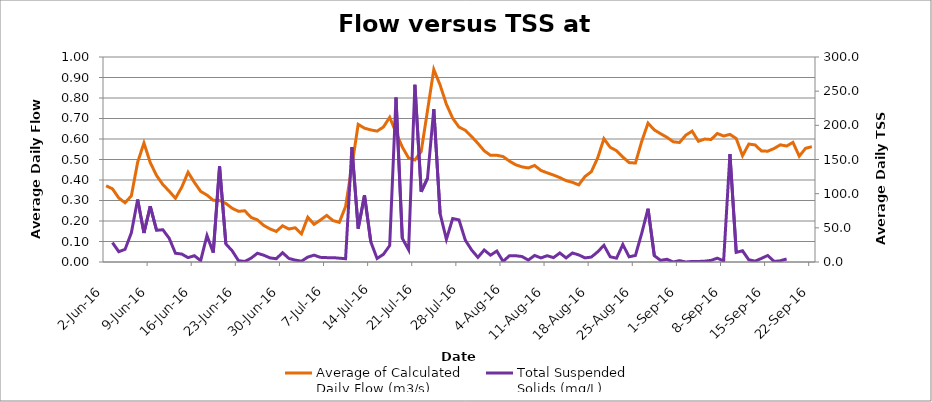
| Category | Average of Calculated 
Daily Flow (m3/s) |
|---|---|
| 2016-06-02 | 0.372 |
| 2016-06-03 | 0.357 |
| 2016-06-04 | 0.313 |
| 2016-06-05 | 0.289 |
| 2016-06-06 | 0.323 |
| 2016-06-07 | 0.486 |
| 2016-06-08 | 0.581 |
| 2016-06-09 | 0.485 |
| 2016-06-10 | 0.422 |
| 2016-06-11 | 0.378 |
| 2016-06-12 | 0.346 |
| 2016-06-13 | 0.311 |
| 2016-06-14 | 0.365 |
| 2016-06-15 | 0.438 |
| 2016-06-16 | 0.388 |
| 2016-06-17 | 0.344 |
| 2016-06-18 | 0.326 |
| 2016-06-19 | 0.301 |
| 2016-06-20 | 0.3 |
| 2016-06-21 | 0.286 |
| 2016-06-22 | 0.262 |
| 2016-06-23 | 0.247 |
| 2016-06-24 | 0.25 |
| 2016-06-25 | 0.217 |
| 2016-06-26 | 0.206 |
| 2016-06-27 | 0.179 |
| 2016-06-28 | 0.161 |
| 2016-06-29 | 0.149 |
| 2016-06-30 | 0.177 |
| 2016-07-01 | 0.161 |
| 2016-07-02 | 0.167 |
| 2016-07-03 | 0.137 |
| 2016-07-04 | 0.218 |
| 2016-07-05 | 0.184 |
| 2016-07-06 | 0.204 |
| 2016-07-07 | 0.227 |
| 2016-07-08 | 0.202 |
| 2016-07-09 | 0.193 |
| 2016-07-10 | 0.271 |
| 2016-07-11 | 0.468 |
| 2016-07-12 | 0.671 |
| 2016-07-13 | 0.653 |
| 2016-07-14 | 0.644 |
| 2016-07-15 | 0.639 |
| 2016-07-16 | 0.658 |
| 2016-07-17 | 0.706 |
| 2016-07-18 | 0.631 |
| 2016-07-19 | 0.561 |
| 2016-07-20 | 0.507 |
| 2016-07-21 | 0.498 |
| 2016-07-22 | 0.539 |
| 2016-07-23 | 0.739 |
| 2016-07-24 | 0.939 |
| 2016-07-25 | 0.863 |
| 2016-07-26 | 0.769 |
| 2016-07-27 | 0.701 |
| 2016-07-28 | 0.658 |
| 2016-07-29 | 0.643 |
| 2016-07-30 | 0.612 |
| 2016-07-31 | 0.579 |
| 2016-08-01 | 0.542 |
| 2016-08-02 | 0.52 |
| 2016-08-03 | 0.521 |
| 2016-08-04 | 0.514 |
| 2016-08-05 | 0.492 |
| 2016-08-06 | 0.474 |
| 2016-08-07 | 0.464 |
| 2016-08-08 | 0.459 |
| 2016-08-09 | 0.471 |
| 2016-08-10 | 0.447 |
| 2016-08-11 | 0.435 |
| 2016-08-12 | 0.424 |
| 2016-08-13 | 0.412 |
| 2016-08-14 | 0.397 |
| 2016-08-15 | 0.389 |
| 2016-08-16 | 0.376 |
| 2016-08-17 | 0.417 |
| 2016-08-18 | 0.44 |
| 2016-08-19 | 0.507 |
| 2016-08-20 | 0.601 |
| 2016-08-21 | 0.559 |
| 2016-08-22 | 0.543 |
| 2016-08-23 | 0.512 |
| 2016-08-24 | 0.485 |
| 2016-08-25 | 0.483 |
| 2016-08-26 | 0.588 |
| 2016-08-27 | 0.677 |
| 2016-08-28 | 0.644 |
| 2016-08-29 | 0.626 |
| 2016-08-30 | 0.608 |
| 2016-08-31 | 0.587 |
| 2016-09-01 | 0.583 |
| 2016-09-02 | 0.619 |
| 2016-09-03 | 0.638 |
| 2016-09-04 | 0.589 |
| 2016-09-05 | 0.6 |
| 2016-09-06 | 0.598 |
| 2016-09-07 | 0.627 |
| 2016-09-08 | 0.614 |
| 2016-09-09 | 0.623 |
| 2016-09-10 | 0.602 |
| 2016-09-11 | 0.519 |
| 2016-09-12 | 0.575 |
| 2016-09-13 | 0.571 |
| 2016-09-14 | 0.542 |
| 2016-09-15 | 0.541 |
| 2016-09-16 | 0.554 |
| 2016-09-17 | 0.572 |
| 2016-09-18 | 0.566 |
| 2016-09-19 | 0.584 |
| 2016-09-20 | 0.516 |
| 2016-09-21 | 0.555 |
| 2016-09-22 | 0.562 |